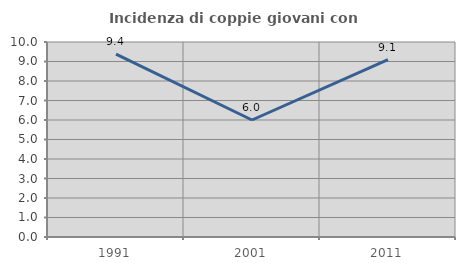
| Category | Incidenza di coppie giovani con figli |
|---|---|
| 1991.0 | 9.375 |
| 2001.0 | 6 |
| 2011.0 | 9.091 |